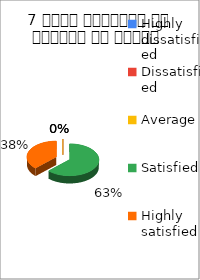
| Category | 7 विषय अवधारणा पर शिक्षक का ज्ञान  |
|---|---|
| Highly dissatisfied | 0 |
| Dissatisfied | 0 |
| Average | 0 |
| Satisfied | 5 |
| Highly satisfied | 3 |